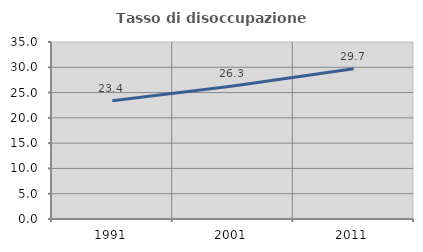
| Category | Tasso di disoccupazione giovanile  |
|---|---|
| 1991.0 | 23.404 |
| 2001.0 | 26.316 |
| 2011.0 | 29.73 |